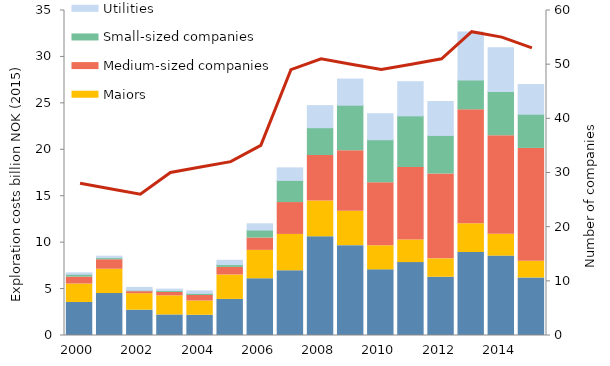
| Category | Large Norwegian companies | Majors | Medium-sized companies | Small-sized companies | Utilities |
|---|---|---|---|---|---|
| 2000.0 | 3.559 | 1.984 | 0.748 | 0.299 | 0.159 |
| 2001.0 | 4.519 | 2.619 | 1.018 | 0.221 | 0.165 |
| 2002.0 | 2.725 | 1.777 | 0.217 | 0.153 | 0.312 |
| 2003.0 | 2.215 | 2.058 | 0.363 | 0.211 | 0.15 |
| 2004.0 | 2.181 | 1.533 | 0.592 | 0.228 | 0.267 |
| 2005.0 | 3.888 | 2.631 | 0.814 | 0.301 | 0.466 |
| 2006.0 | 6.11 | 3.056 | 1.327 | 0.857 | 0.678 |
| 2007.0 | 6.974 | 3.91 | 3.433 | 2.38 | 1.352 |
| 2008.0 | 10.636 | 3.858 | 4.892 | 2.991 | 2.378 |
| 2009.0 | 9.678 | 3.701 | 6.525 | 4.897 | 2.817 |
| 2010.0 | 7.074 | 2.588 | 6.787 | 4.637 | 2.795 |
| 2011.0 | 7.85 | 2.44 | 7.816 | 5.549 | 3.677 |
| 2012.0 | 6.274 | 1.981 | 9.126 | 4.163 | 3.658 |
| 2013.0 | 8.936 | 3.1 | 12.269 | 3.207 | 5.178 |
| 2014.0 | 8.549 | 2.357 | 10.601 | 4.783 | 4.699 |
| 2015.0 | 6.195 | 1.797 | 12.154 | 3.682 | 3.201 |